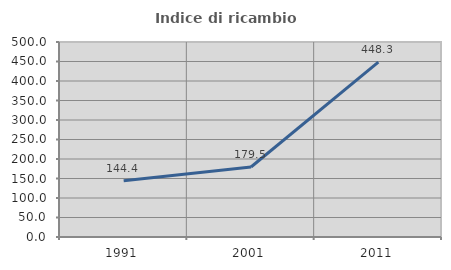
| Category | Indice di ricambio occupazionale  |
|---|---|
| 1991.0 | 144.444 |
| 2001.0 | 179.545 |
| 2011.0 | 448.333 |